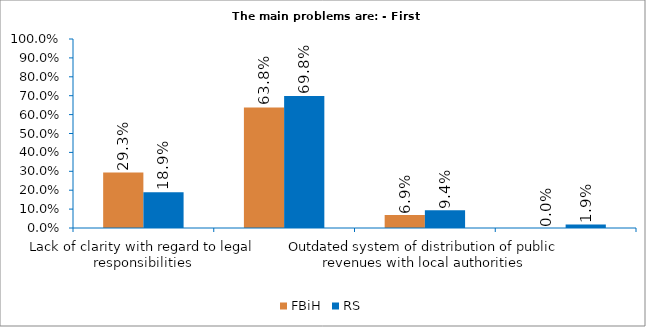
| Category | FBiH | RS |
|---|---|---|
| Lack of clarity with regard to legal responsibilities | 0.293 | 0.189 |
| Insufficient allocation of financial resources for legally assigned competencies | 0.638 | 0.698 |
| Outdated system of distribution of public revenues with local authorities | 0.069 | 0.094 |
| Obstacles to cooperation with other levels and units of administration | 0 | 0.019 |